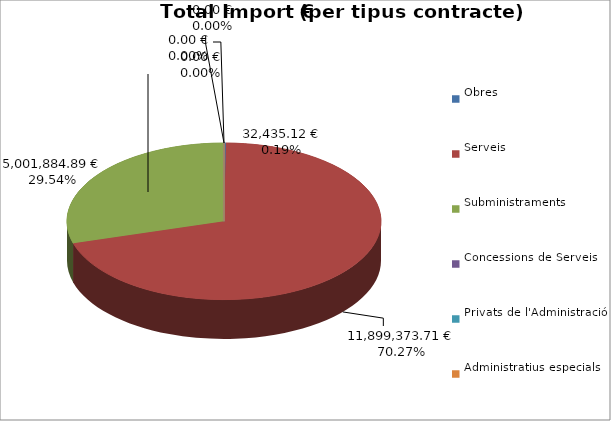
| Category | Total preu
(amb IVA) |
|---|---|
| Obres | 32435.12 |
| Serveis | 11899373.71 |
| Subministraments | 5001884.89 |
| Concessions de Serveis | 0 |
| Privats de l'Administració | 0 |
| Administratius especials | 0 |